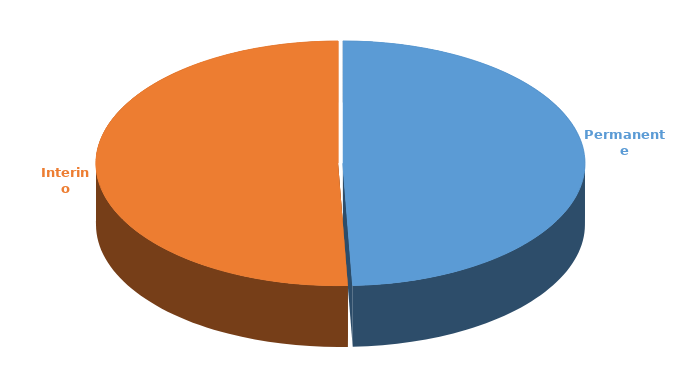
| Category | Cantidad |
|---|---|
| Permanente | 2941 |
| Interino | 3018 |